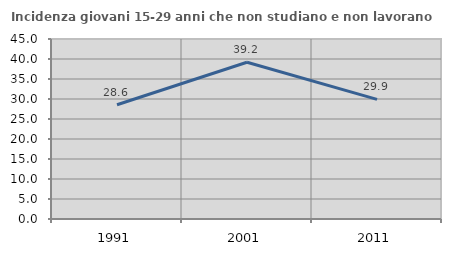
| Category | Incidenza giovani 15-29 anni che non studiano e non lavorano  |
|---|---|
| 1991.0 | 28.571 |
| 2001.0 | 39.2 |
| 2011.0 | 29.907 |